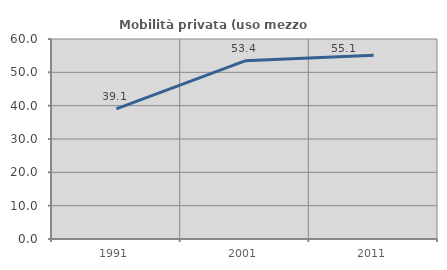
| Category | Mobilità privata (uso mezzo privato) |
|---|---|
| 1991.0 | 39.059 |
| 2001.0 | 53.442 |
| 2011.0 | 55.106 |